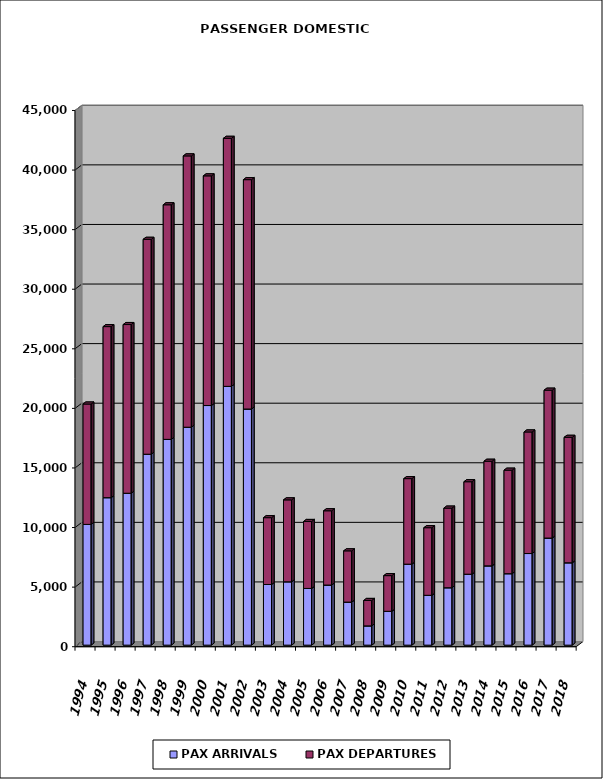
| Category | PAX ARRIVALS | PAX DEPARTURES |
|---|---|---|
| 1994.0 | 10134 | 10100 |
| 1995.0 | 12377 | 14355 |
| 1996.0 | 12748 | 14158 |
| 1997.0 | 16023 | 18035 |
| 1998.0 | 17269 | 19688 |
| 1999.0 | 18289 | 22769 |
| 2000.0 | 20110 | 19273 |
| 2001.0 | 21718 | 20814 |
| 2002.0 | 19817 | 19248 |
| 2003.0 | 5091 | 5607 |
| 2004.0 | 5317 | 6875 |
| 2005.0 | 4758 | 5621 |
| 2006.0 | 5045 | 6232 |
| 2007.0 | 3612 | 4302 |
| 2008.0 | 1617 | 2133 |
| 2009.0 | 2840 | 2995 |
| 2010.0 | 6796 | 7179 |
| 2011.0 | 4183 | 5674 |
| 2012.0 | 4818 | 6682 |
| 2013.0 | 5954 | 7761 |
| 2014.0 | 6654 | 8778 |
| 2015.0 | 5996 | 8688 |
| 2016.0 | 7689 | 10202 |
| 2017.0 | 8987 | 12410 |
| 2018.0 | 6912 | 10529 |